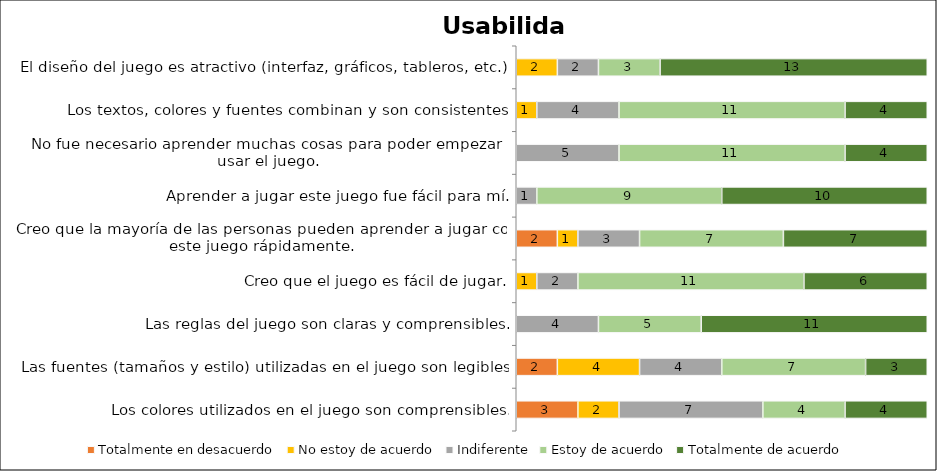
| Category | Totalmente en desacuerdo | No estoy de acuerdo | Indiferente | Estoy de acuerdo | Totalmente de acuerdo |
|---|---|---|---|---|---|
| El diseño del juego es atractivo (interfaz, gráficos, tableros, etc.). | 0 | 2 | 2 | 3 | 13 |
| Los textos, colores y fuentes combinan y son consistentes. | 0 | 1 | 4 | 11 | 4 |
| No fue necesario aprender muchas cosas para poder empezar a usar el juego. | 0 | 0 | 5 | 11 | 4 |
| Aprender a jugar este juego fue fácil para mí. | 0 | 0 | 1 | 9 | 10 |
| Creo que la mayoría de las personas pueden aprender a jugar con este juego rápidamente. | 2 | 1 | 3 | 7 | 7 |
| Creo que el juego es fácil de jugar. | 0 | 1 | 2 | 11 | 6 |
| Las reglas del juego son claras y comprensibles. | 0 | 0 | 4 | 5 | 11 |
| Las fuentes (tamaños y estilo) utilizadas en el juego son legibles. | 2 | 4 | 4 | 7 | 3 |
| Los colores utilizados en el juego son comprensibles. | 3 | 2 | 7 | 4 | 4 |